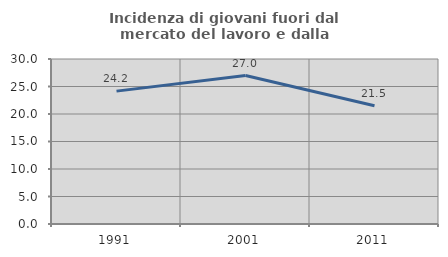
| Category | Incidenza di giovani fuori dal mercato del lavoro e dalla formazione  |
|---|---|
| 1991.0 | 24.16 |
| 2001.0 | 26.987 |
| 2011.0 | 21.491 |